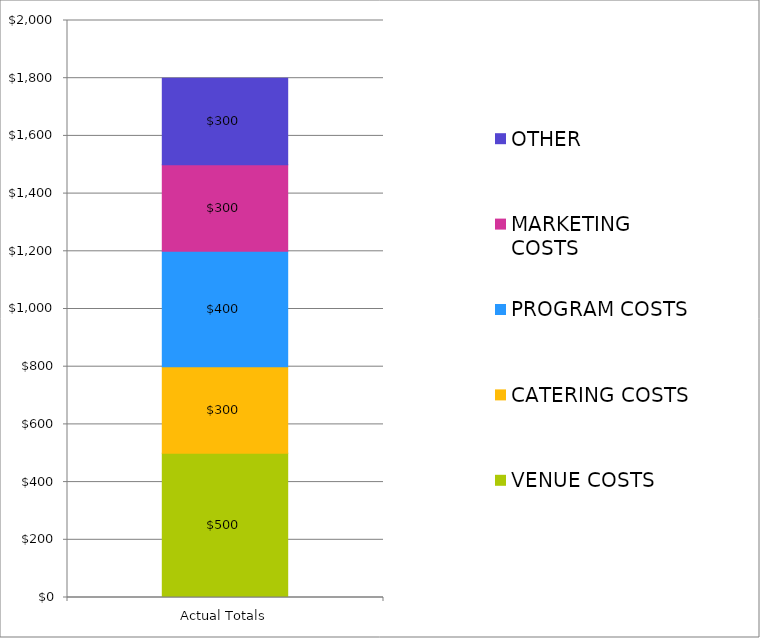
| Category | VENUE COSTS | CATERING COSTS | PROGRAM COSTS | MARKETING COSTS | OTHER |
|---|---|---|---|---|---|
| Actual Totals | 500 | 300 | 400 | 300 | 300 |